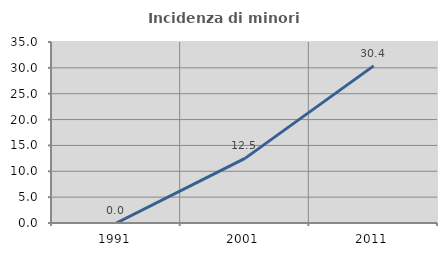
| Category | Incidenza di minori stranieri |
|---|---|
| 1991.0 | 0 |
| 2001.0 | 12.5 |
| 2011.0 | 30.38 |